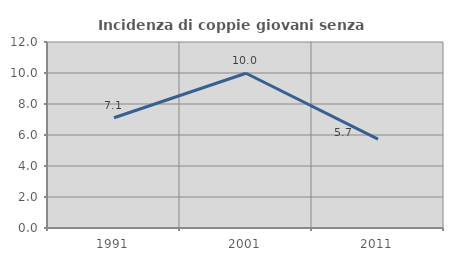
| Category | Incidenza di coppie giovani senza figli |
|---|---|
| 1991.0 | 7.11 |
| 2001.0 | 9.986 |
| 2011.0 | 5.73 |